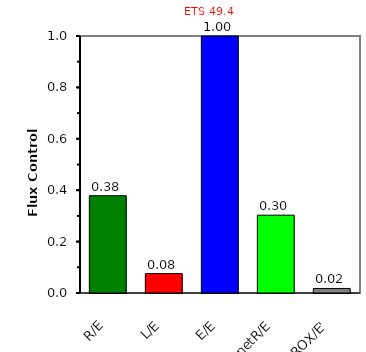
| Category | ETS 49,4 |
|---|---|
| R/E | 0.379 |
| L/E | 0.076 |
| E/E | 1 |
| netR/E | 0.303 |
| ROX/E' | 0.018 |